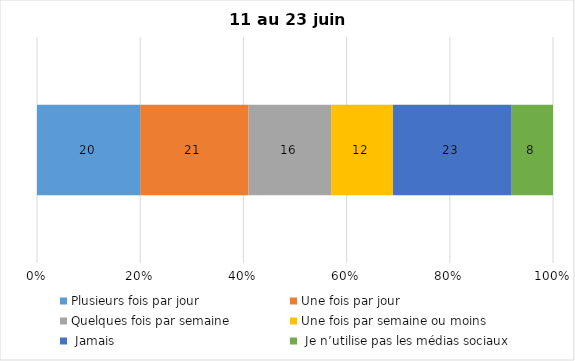
| Category | Plusieurs fois par jour | Une fois par jour | Quelques fois par semaine   | Une fois par semaine ou moins   |  Jamais   |  Je n’utilise pas les médias sociaux |
|---|---|---|---|---|---|---|
| 0 | 20 | 21 | 16 | 12 | 23 | 8 |